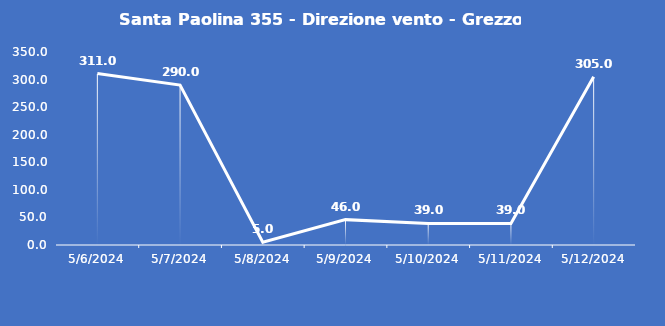
| Category | Santa Paolina 355 - Direzione vento - Grezzo (°N) |
|---|---|
| 5/6/24 | 311 |
| 5/7/24 | 290 |
| 5/8/24 | 5 |
| 5/9/24 | 46 |
| 5/10/24 | 39 |
| 5/11/24 | 39 |
| 5/12/24 | 305 |